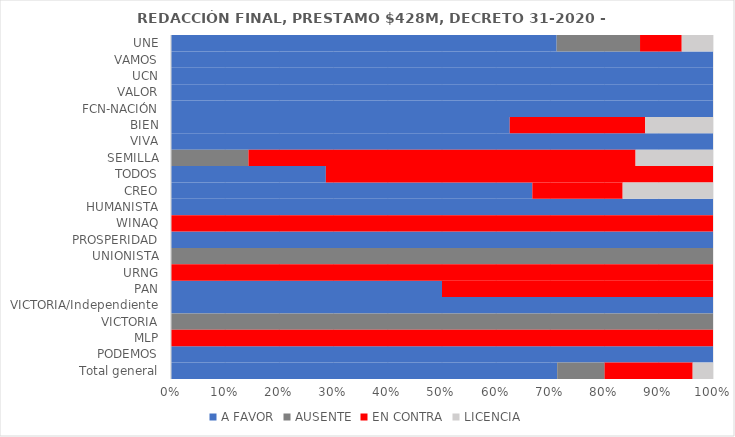
| Category | A FAVOR | AUSENTE | EN CONTRA | LICENCIA |
|---|---|---|---|---|
| UNE | 0.712 | 0.154 | 0.077 | 0.058 |
| VAMOS | 1 | 0 | 0 | 0 |
| UCN | 1 | 0 | 0 | 0 |
| VALOR | 1 | 0 | 0 | 0 |
| FCN-NACIÓN | 1 | 0 | 0 | 0 |
| BIEN | 0.625 | 0 | 0.25 | 0.125 |
| VIVA | 1 | 0 | 0 | 0 |
| SEMILLA | 0 | 0.143 | 0.714 | 0.143 |
| TODOS | 0.286 | 0 | 0.714 | 0 |
| CREO | 0.667 | 0 | 0.167 | 0.167 |
| HUMANISTA | 1 | 0 | 0 | 0 |
| WINAQ | 0 | 0 | 1 | 0 |
| PROSPERIDAD | 1 | 0 | 0 | 0 |
| UNIONISTA | 0 | 1 | 0 | 0 |
| URNG | 0 | 0 | 1 | 0 |
| PAN | 0.5 | 0 | 0.5 | 0 |
| VICTORIA/Independiente | 1 | 0 | 0 | 0 |
| VICTORIA | 0 | 1 | 0 | 0 |
| MLP | 0 | 0 | 1 | 0 |
| PODEMOS | 1 | 0 | 0 | 0 |
| Total general | 0.712 | 0.088 | 0.162 | 0.038 |